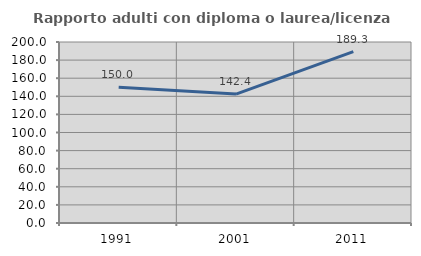
| Category | Rapporto adulti con diploma o laurea/licenza media  |
|---|---|
| 1991.0 | 150 |
| 2001.0 | 142.424 |
| 2011.0 | 189.286 |